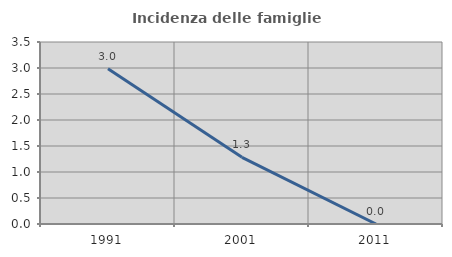
| Category | Incidenza delle famiglie numerose |
|---|---|
| 1991.0 | 2.985 |
| 2001.0 | 1.282 |
| 2011.0 | 0 |